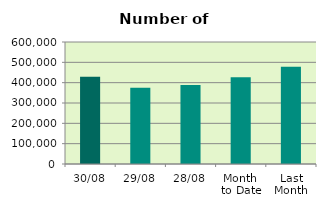
| Category | Series 0 |
|---|---|
| 30/08 | 428750 |
| 29/08 | 374576 |
| 28/08 | 389092 |
| Month 
to Date | 426679.545 |
| Last
Month | 477777.545 |